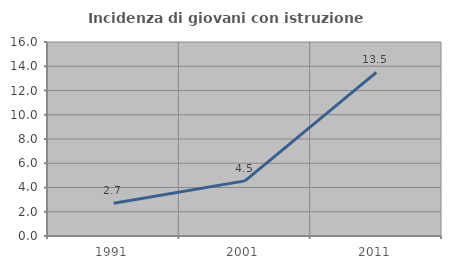
| Category | Incidenza di giovani con istruzione universitaria |
|---|---|
| 1991.0 | 2.703 |
| 2001.0 | 4.545 |
| 2011.0 | 13.492 |